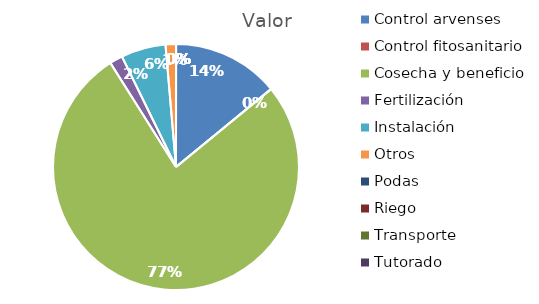
| Category | Valor |
|---|---|
| Control arvenses | 11090970 |
| Control fitosanitario | 0 |
| Cosecha y beneficio | 60676000 |
| Fertilización | 1344360 |
| Instalación | 4638042 |
| Otros | 1075488 |
| Podas | 0 |
| Riego | 0 |
| Transporte | 0 |
| Tutorado | 0 |